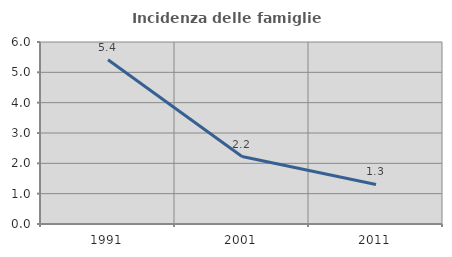
| Category | Incidenza delle famiglie numerose |
|---|---|
| 1991.0 | 5.414 |
| 2001.0 | 2.223 |
| 2011.0 | 1.303 |